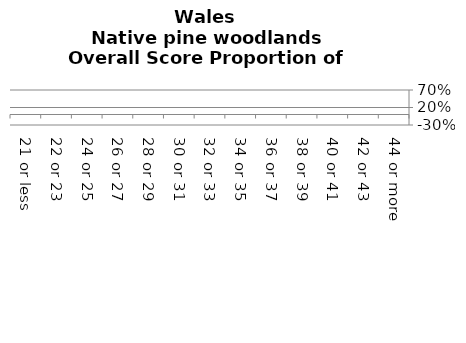
| Category | Native pine woodlands |
|---|---|
| 21 or less | 0 |
| 22 or 23 | 0 |
| 24 or 25 | 0 |
| 26 or 27 | 0 |
| 28 or 29 | 0 |
| 30 or 31 | 0 |
| 32 or 33 | 0 |
| 34 or 35 | 0 |
| 36 or 37 | 0 |
| 38 or 39 | 0 |
| 40 or 41 | 0 |
| 42 or 43 | 0 |
| 44 or more | 0 |